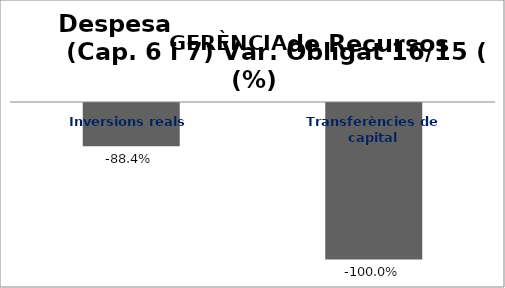
| Category | Series 0 |
|---|---|
| Inversions reals | -0.884 |
| Transferències de capital | -1 |